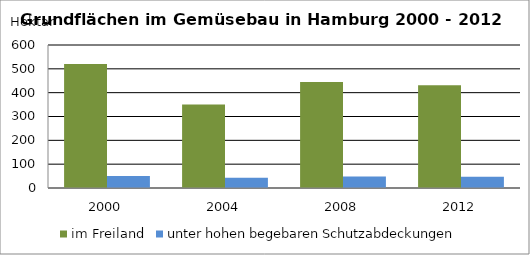
| Category | im Freiland | unter hohen begebaren Schutzabdeckungen |
|---|---|---|
| 2000.0 | 520.2 | 50.7 |
| 2004.0 | 350.5 | 42.5 |
| 2008.0 | 444.4 | 48.3 |
| 2012.0 | 430.7 | 47.5 |